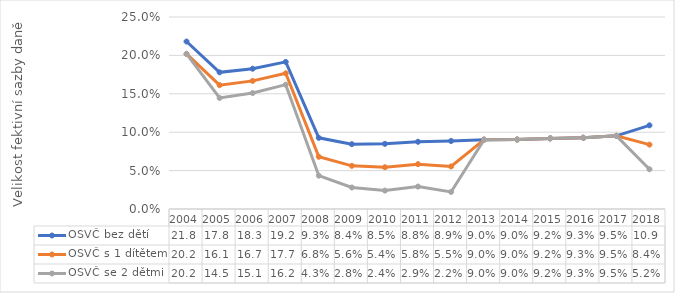
| Category | OSVČ bez dětí | OSVČ s 1 dítětem | OSVČ se 2 dětmi |
|---|---|---|---|
| 2004.0 | 0.218 | 0.202 | 0.202 |
| 2005.0 | 0.178 | 0.161 | 0.145 |
| 2006.0 | 0.183 | 0.167 | 0.151 |
| 2007.0 | 0.192 | 0.177 | 0.162 |
| 2008.0 | 0.093 | 0.068 | 0.043 |
| 2009.0 | 0.084 | 0.056 | 0.028 |
| 2010.0 | 0.085 | 0.054 | 0.024 |
| 2011.0 | 0.088 | 0.058 | 0.029 |
| 2012.0 | 0.089 | 0.055 | 0.022 |
| 2013.0 | 0.09 | 0.09 | 0.09 |
| 2014.0 | 0.09 | 0.09 | 0.09 |
| 2015.0 | 0.092 | 0.092 | 0.092 |
| 2016.0 | 0.093 | 0.093 | 0.093 |
| 2017.0 | 0.095 | 0.095 | 0.095 |
| 2018.0 | 0.109 | 0.084 | 0.052 |